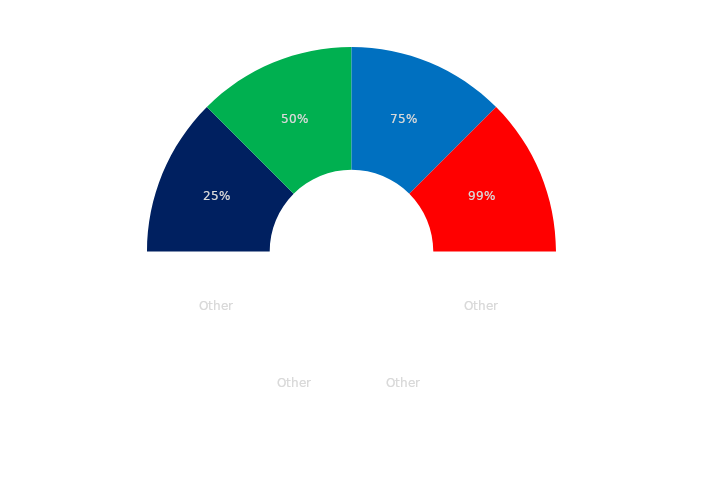
| Category | Series 0 |
|---|---|
| 0.25 | 0.125 |
| 0.5 | 0.125 |
| 0.75 | 0.125 |
| 0.99 | 0.125 |